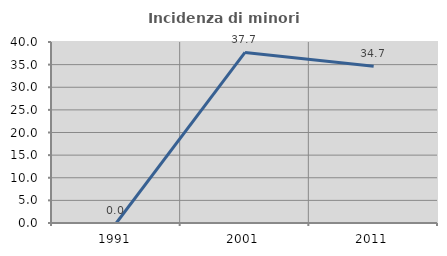
| Category | Incidenza di minori stranieri |
|---|---|
| 1991.0 | 0 |
| 2001.0 | 37.705 |
| 2011.0 | 34.659 |